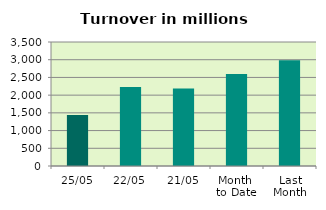
| Category | Series 0 |
|---|---|
| 25/05 | 1440.76 |
| 22/05 | 2231.519 |
| 21/05 | 2184.682 |
| Month 
to Date | 2596.833 |
| Last
Month | 2985.476 |